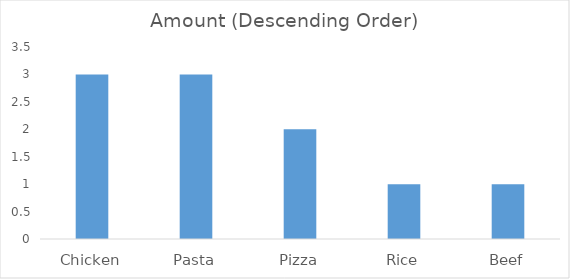
| Category | Amount (Descending Order) |
|---|---|
| Chicken | 3 |
| Pasta | 3 |
| Pizza | 2 |
| Rice | 1 |
| Beef | 1 |